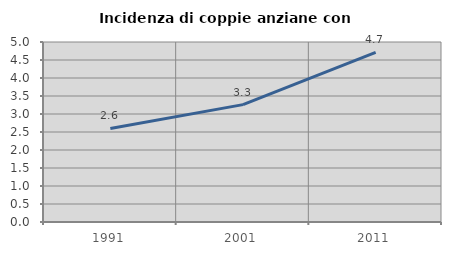
| Category | Incidenza di coppie anziane con figli |
|---|---|
| 1991.0 | 2.599 |
| 2001.0 | 3.26 |
| 2011.0 | 4.714 |